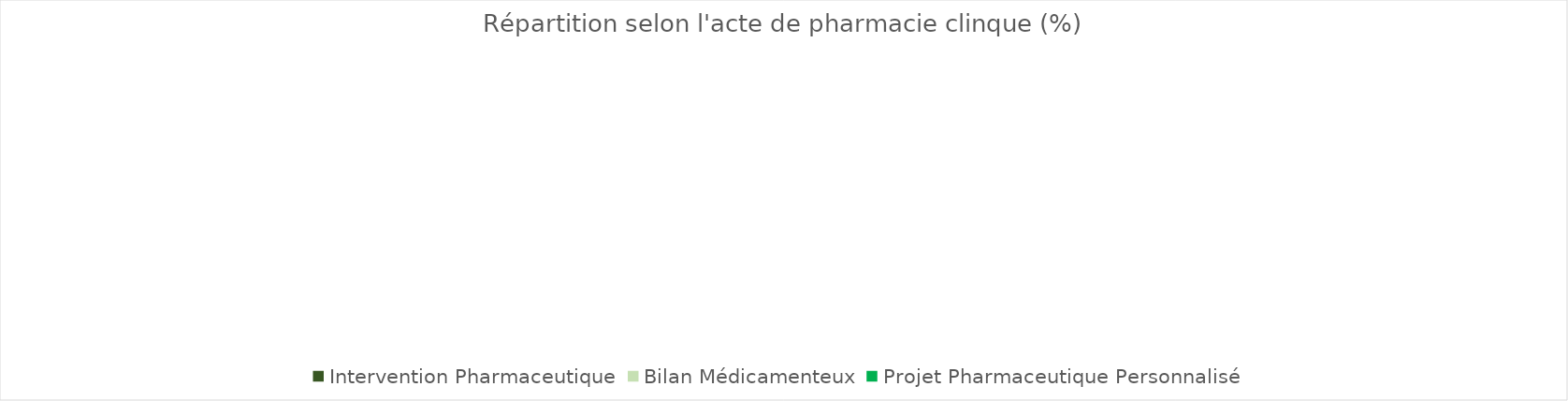
| Category | Series 0 |
|---|---|
| Intervention Pharmaceutique | 0 |
| Bilan Médicamenteux | 0 |
| Projet Pharmaceutique Personnalisé | 0 |